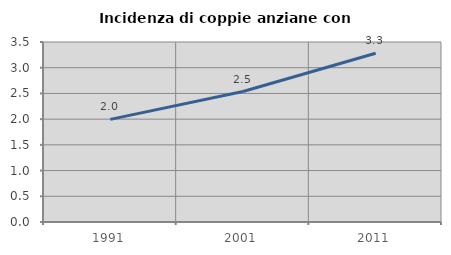
| Category | Incidenza di coppie anziane con figli |
|---|---|
| 1991.0 | 1.996 |
| 2001.0 | 2.537 |
| 2011.0 | 3.282 |